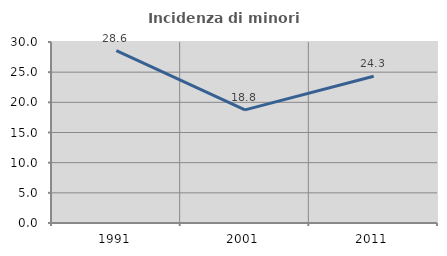
| Category | Incidenza di minori stranieri |
|---|---|
| 1991.0 | 28.571 |
| 2001.0 | 18.75 |
| 2011.0 | 24.324 |